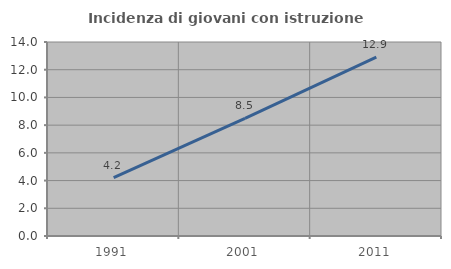
| Category | Incidenza di giovani con istruzione universitaria |
|---|---|
| 1991.0 | 4.211 |
| 2001.0 | 8.491 |
| 2011.0 | 12.903 |